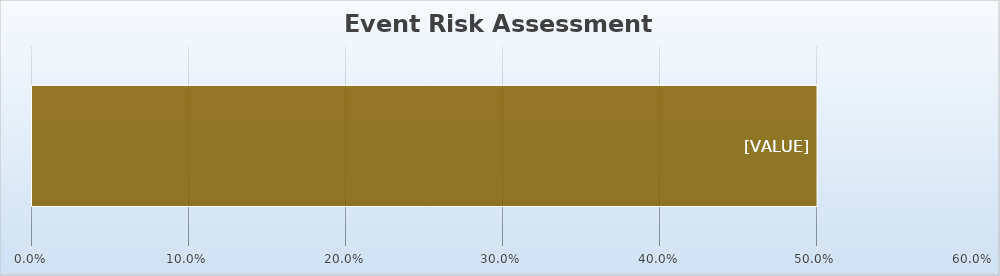
| Category | Series 0 |
|---|---|
| 0 | 0.5 |